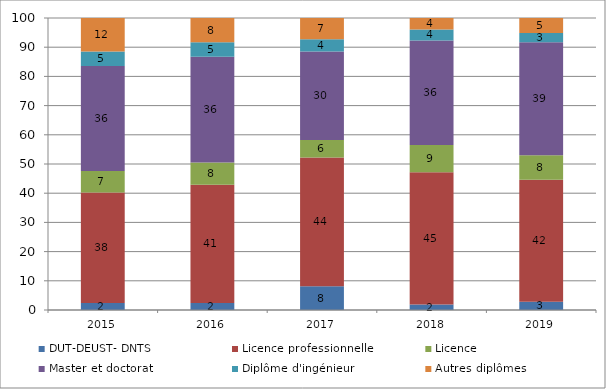
| Category | DUT-DEUST- DNTS | Licence professionnelle | Licence | Master et doctorat | Diplôme d'ingénieur | Autres diplômes  |
|---|---|---|---|---|---|---|
| 2015.0 | 2.4 | 37.8 | 7.4 | 36 | 4.9 | 11.5 |
| 2016.0 | 2.4 | 40.5 | 7.6 | 36.2 | 5 | 8.3 |
| 2017.0 | 8.1 | 44.1 | 6 | 30.3 | 4.2 | 7.3 |
| 2018.0 | 1.9 | 45.3 | 9.3 | 35.8 | 3.8 | 3.9 |
| 2019.0 | 2.8 | 41.8 | 8.4 | 38.7 | 3.2 | 5.1 |